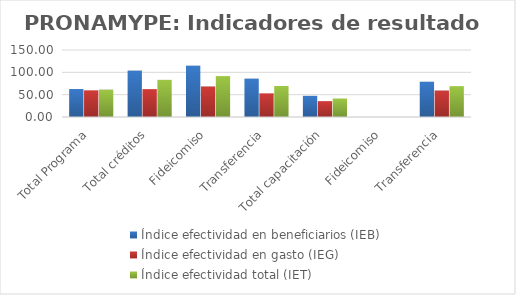
| Category | Índice efectividad en beneficiarios (IEB) | Índice efectividad en gasto (IEG)  | Índice efectividad total (IET) |
|---|---|---|---|
| Total Programa | 62.622 | 59.701 | 61.161 |
| Total créditos | 103.8 | 62.418 | 83.109 |
| Fideicomiso | 114.887 | 68.278 | 91.583 |
| Transferencia | 85.864 | 52.937 | 69.4 |
| Total capacitación | 47.37 | 35.52 | 41.445 |
| Fideicomiso | 0 | 0 | 0 |
| Transferencia | 78.951 | 59.199 | 69.075 |